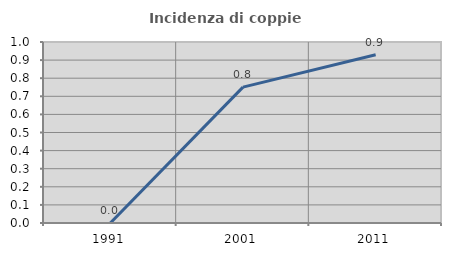
| Category | Incidenza di coppie miste |
|---|---|
| 1991.0 | 0 |
| 2001.0 | 0.75 |
| 2011.0 | 0.93 |